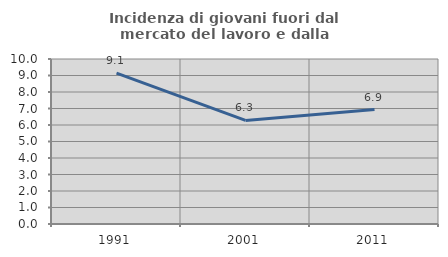
| Category | Incidenza di giovani fuori dal mercato del lavoro e dalla formazione  |
|---|---|
| 1991.0 | 9.145 |
| 2001.0 | 6.279 |
| 2011.0 | 6.938 |